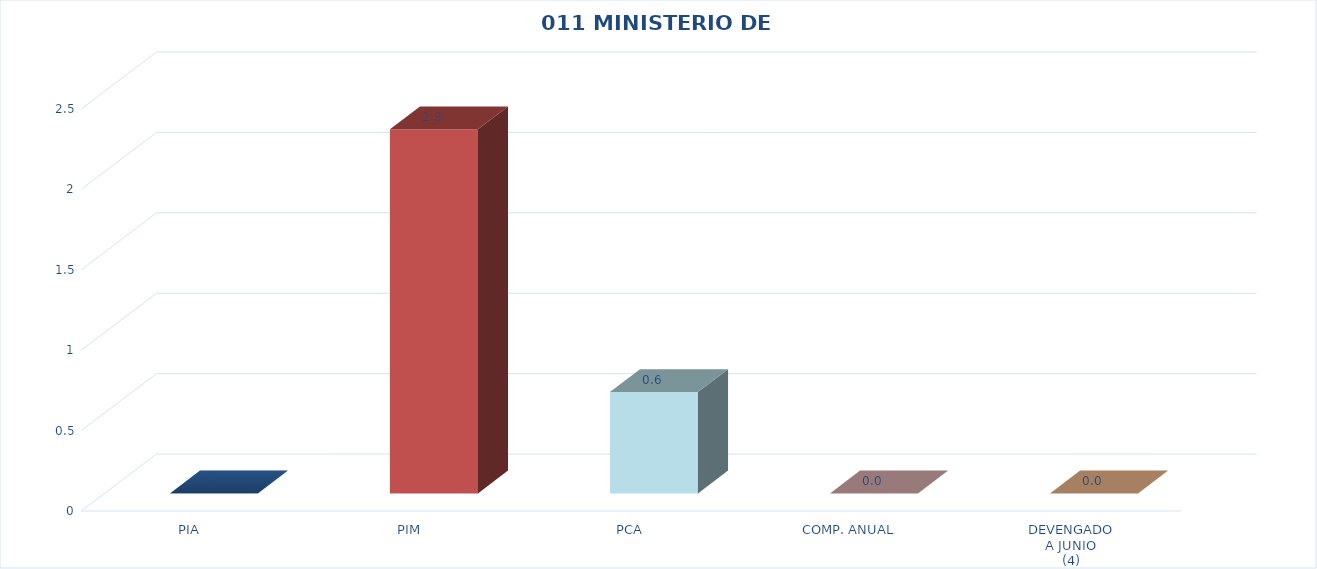
| Category | 011 MINISTERIO DE SALUD |
|---|---|
| PIA | 0 |
| PIM | 2.265 |
| PCA | 0.63 |
| COMP. ANUAL | 0 |
| DEVENGADO
A JUNIO
(4) | 0 |